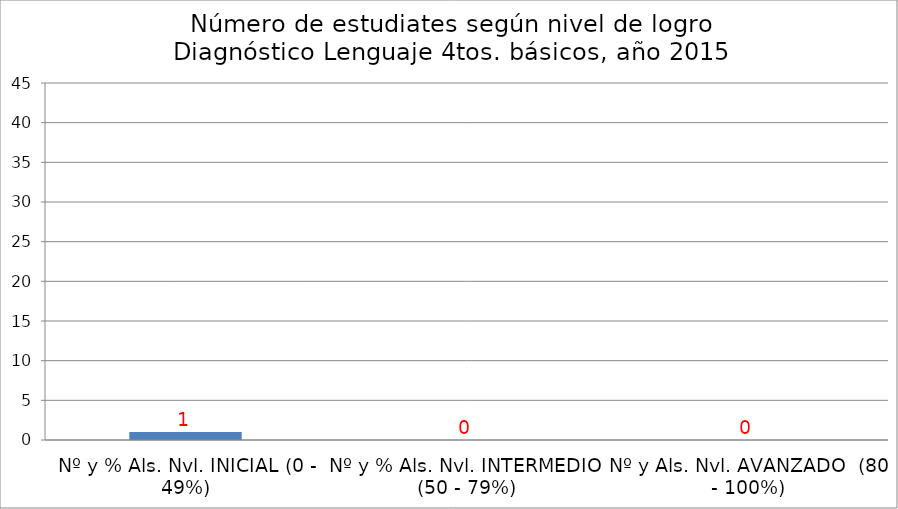
| Category | Series 0 |
|---|---|
| Nº y % Als. Nvl. INICIAL (0 - 49%) | 1 |
| Nº y % Als. Nvl. INTERMEDIO  (50 - 79%) | 0 |
| Nº y Als. Nvl. AVANZADO  (80 - 100%) | 0 |